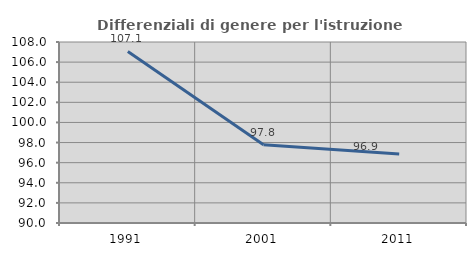
| Category | Differenziali di genere per l'istruzione superiore |
|---|---|
| 1991.0 | 107.062 |
| 2001.0 | 97.782 |
| 2011.0 | 96.869 |